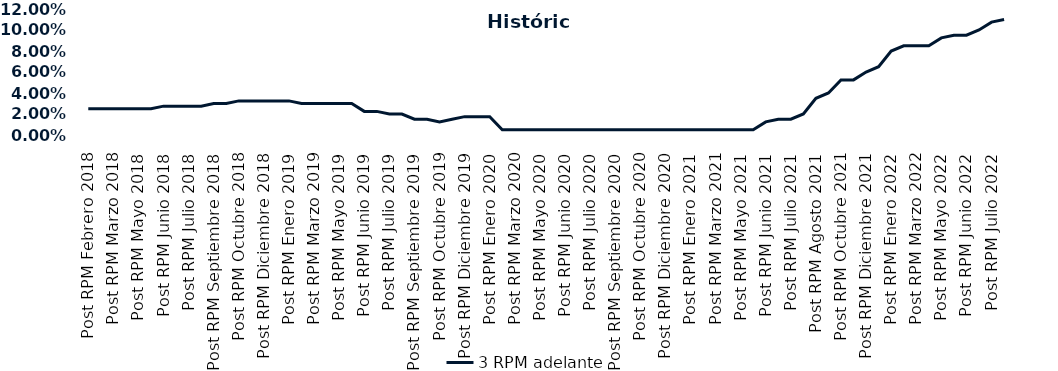
| Category | 3 RPM adelante |
|---|---|
| Post RPM Febrero 2018 | 0.025 |
| Pre RPM Marzo 2018 | 0.025 |
| Post RPM Marzo 2018 | 0.025 |
| Pre RPM Mayo 2018 | 0.025 |
| Post RPM Mayo 2018 | 0.025 |
| Pre RPM Junio 2018 | 0.025 |
| Post RPM Junio 2018 | 0.028 |
| Pre RPM Julio 2018 | 0.028 |
| Post RPM Julio 2018 | 0.028 |
| Pre RPM Septiembre 2018 | 0.028 |
| Post RPM Septiembre 2018 | 0.03 |
| Pre RPM Octubre 2018 | 0.03 |
| Post RPM Octubre 2018 | 0.032 |
| Pre RPM Diciembre 2018 | 0.032 |
| Post RPM Diciembre 2018 | 0.032 |
| Pre RPM Enero 2019 | 0.032 |
| Post RPM Enero 2019 | 0.032 |
| Pre RPM Marzo 2019 | 0.03 |
| Post RPM Marzo 2019 | 0.03 |
| Pre RPM Mayo 2019 | 0.03 |
| Post RPM Mayo 2019 | 0.03 |
| Pre RPM Junio 2019 | 0.03 |
| Post RPM Junio 2019 | 0.022 |
| Pre RPM Julio 2019 | 0.022 |
| Post RPM Julio 2019 | 0.02 |
| Pre RPM Septiembre 2019 | 0.02 |
| Post RPM Septiembre 2019 | 0.015 |
| Pre RPM Octubre 2019 | 0.015 |
| Post RPM Octubre 2019 | 0.012 |
| Pre RPM Diciembre 2019 | 0.015 |
| Post RPM Diciembre 2019 | 0.018 |
| Pre RPM Enero 2020 | 0.018 |
| Post RPM Enero 2020 | 0.018 |
| Pre RPM Marzo 2020 | 0.005 |
| Post RPM Marzo 2020 | 0.005 |
| Pre RPM Mayo 2020 | 0.005 |
| Post RPM Mayo 2020 | 0.005 |
| Pre RPM Junio 2020 | 0.005 |
| Post RPM Junio 2020 | 0.005 |
| Pre RPM Julio 2020 | 0.005 |
| Post RPM Julio 2020 | 0.005 |
| Pre RPM Septiembre 2020 | 0.005 |
| Post RPM Septiembre 2020 | 0.005 |
| Pre RPM Octubre 2020 | 0.005 |
| Post RPM Octubre 2020 | 0.005 |
| Pre RPM Diciembre 2020 | 0.005 |
| Post RPM Diciembre 2020 | 0.005 |
| Pre RPM Enero 2021 | 0.005 |
| Post RPM Enero 2021 | 0.005 |
| Pre RPM Marzo 2021 | 0.005 |
| Post RPM Marzo 2021 | 0.005 |
| Pre RPM Mayo 2021 | 0.005 |
| Post RPM Mayo 2021 | 0.005 |
| Pre RPM Junio 2021 | 0.005 |
| Post RPM Junio 2021 | 0.012 |
| Pre RPM Julio 2021 | 0.015 |
| Post RPM Julio 2021 | 0.015 |
| Pre RPM Agosto 2021 | 0.02 |
| Post RPM Agosto 2021 | 0.035 |
| Pre RPM Octubre 2021 | 0.04 |
| Post RPM Octubre 2021 | 0.052 |
| Pre RPM Diciembre 2021 | 0.052 |
| Post RPM Diciembre 2021 | 0.06 |
| Pre RPM Enero 2022 | 0.065 |
| Post RPM Enero 2022 | 0.08 |
| Pre RPM Marzo 2022 | 0.085 |
| Post RPM Marzo 2022 | 0.085 |
| Pre RPM Mayo 2022 | 0.085 |
| Post RPM Mayo 2022 | 0.092 |
| Pre RPM Junio 2022 | 0.095 |
| Post RPM Junio 2022 | 0.095 |
| Pre RPM Julio 2022 | 0.1 |
| Post RPM Julio 2022 | 0.108 |
| Pre RPM Septiembre 2022 | 0.11 |